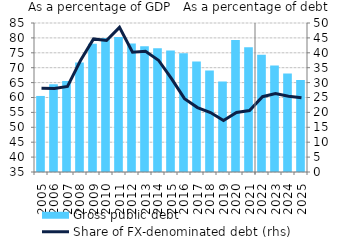
| Category | Gross public debt |
|---|---|
| 2005.0 | 60.518 |
| 2006.0 | 64.427 |
| 2007.0 | 65.55 |
| 2008.0 | 71.757 |
| 2009.0 | 78.032 |
| 2010.0 | 80.007 |
| 2011.0 | 80.338 |
| 2012.0 | 78.155 |
| 2013.0 | 77.198 |
| 2014.0 | 76.542 |
| 2015.0 | 75.76 |
| 2016.0 | 74.85 |
| 2017.0 | 72.114 |
| 2018.0 | 69.078 |
| 2019.0 | 65.329 |
| 2020.0 | 79.297 |
| 2021.0 | 76.827 |
| 2022.0 | 74.311 |
| 2023.0 | 70.756 |
| 2024.0 | 68.083 |
| 2025.0 | 65.871 |